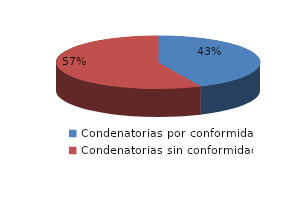
| Category | Series 0 |
|---|---|
| 0 | 19 |
| 1 | 25 |